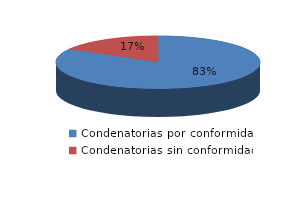
| Category | Series 0 |
|---|---|
| 0 | 60 |
| 1 | 12 |